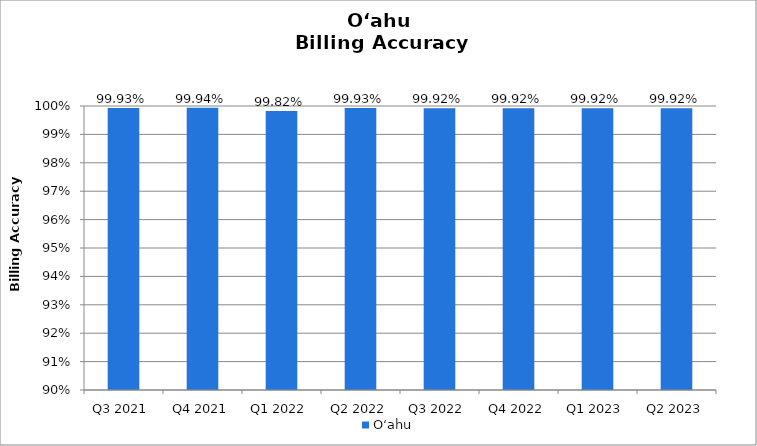
| Category | O‘ahu |
|---|---|
| Q3 2021 | 0.999 |
| Q4 2021 | 0.999 |
| Q1 2022 | 0.998 |
| Q2 2022 | 0.999 |
| Q3 2022 | 0.999 |
| Q4 2022 | 0.999 |
| Q1 2023 | 0.999 |
| Q2 2023 | 0.999 |